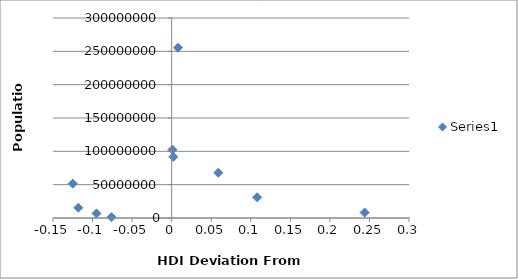
| Category | Series 0 |
|---|---|
| -0.1180000000000001 | 15458332 |
| -0.07600000000000007 | 1201542 |
| 0.007999999999999896 | 255461700 |
| -0.09500000000000008 | 6803699 |
| 0.10799999999999998 | 31068000 |
| -0.125 | 51486253 |
| 0.0010000000000000009 | 102580000 |
| 0.244 | 8211700 |
| 0.05899999999999994 | 67959000 |
| 0.0020000000000000018 | 91700000 |